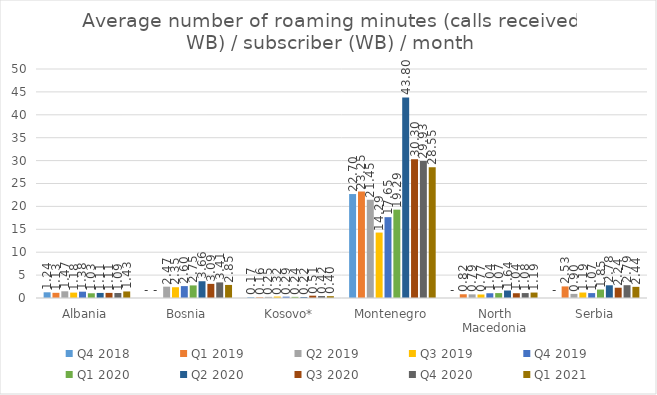
| Category | Q4 2018 | Q1 2019 | Q2 2019 | Q3 2019 | Q4 2019 | Q1 2020 | Q2 2020 | Q3 2020 | Q4 2020 | Q1 2021 |
|---|---|---|---|---|---|---|---|---|---|---|
| Albania | 1.245 | 1.133 | 1.465 | 1.177 | 1.381 | 1.033 | 1.106 | 1.114 | 1.091 | 1.429 |
| Bosnia | 0 | 0 | 2.474 | 2.351 | 2.597 | 2.749 | 3.659 | 3.086 | 3.408 | 2.853 |
| Kosovo* | 0.171 | 0.162 | 0.246 | 0.318 | 0.288 | 0.245 | 0.218 | 0.507 | 0.423 | 0.399 |
| Montenegro | 22.698 | 23.251 | 21.452 | 14.287 | 17.65 | 19.287 | 43.797 | 30.3 | 29.929 | 28.553 |
| North Macedonia | 0 | 0.818 | 0.793 | 0.767 | 1.037 | 1.073 | 1.636 | 1.043 | 1.077 | 1.187 |
| Serbia | 0 | 2.529 | 0.898 | 1.193 | 1.073 | 1.845 | 2.777 | 2.243 | 2.794 | 2.435 |